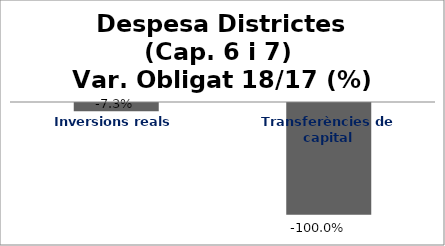
| Category | Series 0 |
|---|---|
| Inversions reals | -0.073 |
| Transferències de capital | -1 |